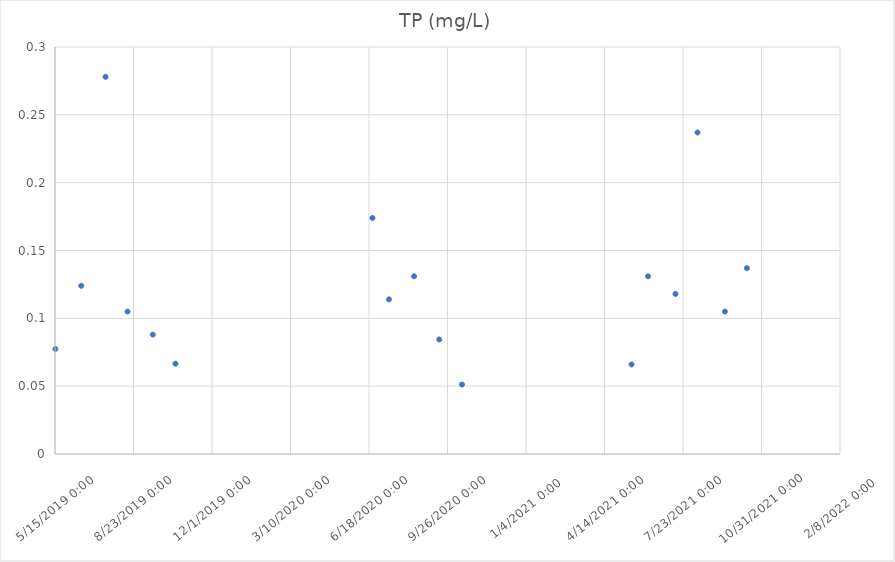
| Category | TP (mg/L) |
|---|---|
| 43600.479166666664 | 0.077 |
| 43633.44930555556 | 0.124 |
| 43664.413194444445 | 0.278 |
| 43692.38333333333 | 0.105 |
| 43724.555555555555 | 0.088 |
| 43753.436111111114 | 0.067 |
| 44004.402083333334 | 0.174 |
| 44025.42361111111 | 0.114 |
| 44057.419444444444 | 0.131 |
| 44089.42986111111 | 0.084 |
| 44118.43819444445 | 0.051 |
| 44334.436111111114 | 0.066 |
| 44355.461805555555 | 0.131 |
| 44390.416666666664 | 0.118 |
| 44418.46875 | 0.237 |
| 44453.416666666664 | 0.105 |
| 44481.4375 | 0.137 |